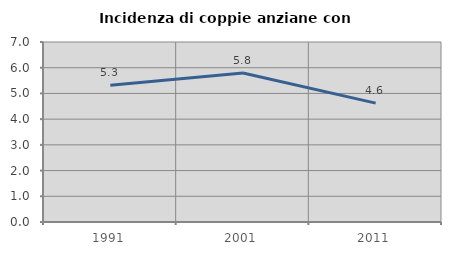
| Category | Incidenza di coppie anziane con figli |
|---|---|
| 1991.0 | 5.322 |
| 2001.0 | 5.793 |
| 2011.0 | 4.624 |